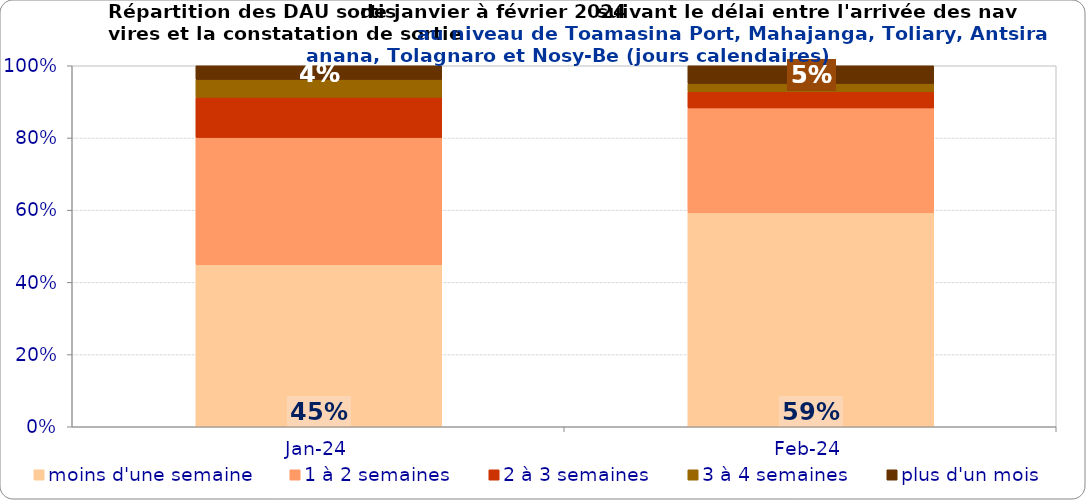
| Category | moins d'une semaine | 1 à 2 semaines | 2 à 3 semaines | 3 à 4 semaines | plus d'un mois |
|---|---|---|---|---|---|
| 2024-01-01 | 0.449 | 0.352 | 0.112 | 0.049 | 0.038 |
| 2024-02-01 | 0.593 | 0.291 | 0.045 | 0.023 | 0.049 |